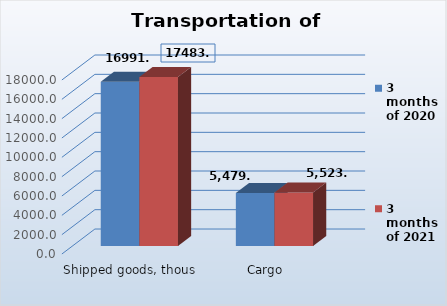
| Category | 3 months of 2020 | 3 months of 2021 |
|---|---|---|
| Shipped goods, thous. tons | 16991.5 | 17483.8 |
| Cargo turnover, mln.t.km | 5479.2 | 5523.5 |